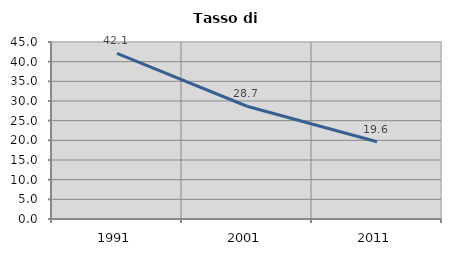
| Category | Tasso di disoccupazione   |
|---|---|
| 1991.0 | 42.118 |
| 2001.0 | 28.666 |
| 2011.0 | 19.627 |